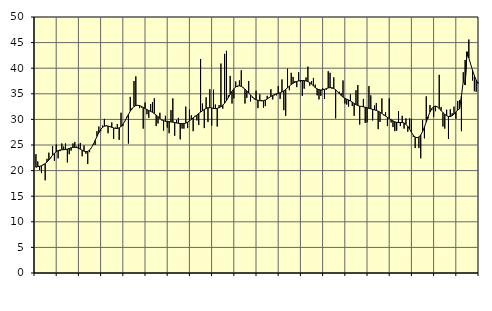
| Category | Piggar | Series 1 |
|---|---|---|
| nan | 23.2 | 20.65 |
| 1.0 | 21.8 | 20.78 |
| 1.0 | 20.1 | 20.84 |
| 1.0 | 19.5 | 20.94 |
| 1.0 | 21.3 | 21.12 |
| 1.0 | 18.1 | 21.36 |
| 1.0 | 22.3 | 21.67 |
| 1.0 | 23.5 | 22.07 |
| 1.0 | 22.4 | 22.53 |
| 1.0 | 24.8 | 23 |
| 1.0 | 21.9 | 23.41 |
| 1.0 | 25.1 | 23.72 |
| nan | 22.4 | 23.92 |
| 2.0 | 23.8 | 24.02 |
| 2.0 | 25.3 | 24.06 |
| 2.0 | 24.7 | 24.08 |
| 2.0 | 25.3 | 24.13 |
| 2.0 | 21.6 | 24.21 |
| 2.0 | 23.2 | 24.33 |
| 2.0 | 23.9 | 24.45 |
| 2.0 | 25.3 | 24.53 |
| 2.0 | 25.6 | 24.55 |
| 2.0 | 24.7 | 24.5 |
| 2.0 | 25.1 | 24.37 |
| nan | 25.4 | 24.18 |
| 3.0 | 22.8 | 23.98 |
| 3.0 | 24.9 | 23.8 |
| 3.0 | 23.3 | 23.7 |
| 3.0 | 21.3 | 23.75 |
| 3.0 | 23.6 | 24 |
| 3.0 | 24.4 | 24.47 |
| 3.0 | 25 | 25.12 |
| 3.0 | 25 | 25.89 |
| 3.0 | 27.7 | 26.68 |
| 3.0 | 28.6 | 27.42 |
| 3.0 | 27.7 | 28.02 |
| nan | 28.8 | 28.44 |
| 4.0 | 30.1 | 28.67 |
| 4.0 | 28.9 | 28.74 |
| 4.0 | 27.3 | 28.69 |
| 4.0 | 28.7 | 28.58 |
| 4.0 | 29.4 | 28.45 |
| 4.0 | 26.2 | 28.33 |
| 4.0 | 28.4 | 28.24 |
| 4.0 | 29.1 | 28.23 |
| 4.0 | 26 | 28.35 |
| 4.0 | 31.3 | 28.61 |
| 4.0 | 28.7 | 29.05 |
| nan | 29.7 | 29.62 |
| 5.0 | 30.5 | 30.28 |
| 5.0 | 25.3 | 30.97 |
| 5.0 | 34.4 | 31.61 |
| 5.0 | 32 | 32.14 |
| 5.0 | 37.5 | 32.5 |
| 5.0 | 38.4 | 32.7 |
| 5.0 | 32.7 | 32.76 |
| 5.0 | 32.2 | 32.7 |
| 5.0 | 32.3 | 32.55 |
| 5.0 | 28.2 | 32.35 |
| 5.0 | 33.3 | 32.13 |
| nan | 31 | 31.92 |
| 6.0 | 30.3 | 31.74 |
| 6.0 | 33 | 31.58 |
| 6.0 | 33.4 | 31.39 |
| 6.0 | 34.1 | 31.14 |
| 6.0 | 28.7 | 30.85 |
| 6.0 | 29.2 | 30.52 |
| 6.0 | 31.3 | 30.19 |
| 6.0 | 29.8 | 29.92 |
| 6.0 | 27.8 | 29.75 |
| 6.0 | 30.7 | 29.64 |
| 6.0 | 28.4 | 29.59 |
| nan | 27.3 | 29.55 |
| 7.0 | 31.8 | 29.51 |
| 7.0 | 34.1 | 29.46 |
| 7.0 | 26.8 | 29.39 |
| 7.0 | 29.9 | 29.3 |
| 7.0 | 30.3 | 29.24 |
| 7.0 | 26.1 | 29.2 |
| 7.0 | 28.2 | 29.17 |
| 7.0 | 28.2 | 29.19 |
| 7.0 | 32.5 | 29.28 |
| 7.0 | 28.3 | 29.46 |
| 7.0 | 31.9 | 29.7 |
| nan | 30.8 | 30 |
| 8.0 | 27.7 | 30.3 |
| 8.0 | 30.7 | 30.58 |
| 8.0 | 29.8 | 30.85 |
| 8.0 | 28.9 | 31.14 |
| 8.0 | 41.8 | 31.42 |
| 8.0 | 33.1 | 31.69 |
| 8.0 | 28.3 | 31.95 |
| 8.0 | 34.3 | 32.15 |
| 8.0 | 29.5 | 32.27 |
| 8.0 | 35.9 | 32.28 |
| 8.0 | 28.8 | 32.23 |
| nan | 35.8 | 32.15 |
| 9.0 | 32.9 | 32.11 |
| 9.0 | 28.6 | 32.15 |
| 9.0 | 32.8 | 32.28 |
| 9.0 | 40.9 | 32.49 |
| 9.0 | 32.1 | 32.78 |
| 9.0 | 42.8 | 33.17 |
| 9.0 | 43.4 | 33.67 |
| 9.0 | 34.7 | 34.27 |
| 9.0 | 38.5 | 34.88 |
| 9.0 | 33.1 | 35.48 |
| 9.0 | 34.1 | 35.98 |
| nan | 37.4 | 36.34 |
| 10.0 | 36.4 | 36.53 |
| 10.0 | 37.6 | 36.56 |
| 10.0 | 39.6 | 36.45 |
| 10.0 | 36.1 | 36.22 |
| 10.0 | 33.1 | 35.91 |
| 10.0 | 34.2 | 35.54 |
| 10.0 | 37.5 | 35.16 |
| 10.0 | 33.5 | 34.77 |
| 10.0 | 34.2 | 34.4 |
| 10.0 | 33.9 | 34.08 |
| 10.0 | 35.6 | 33.86 |
| nan | 32.2 | 33.73 |
| 11.0 | 34.9 | 33.65 |
| 11.0 | 33.8 | 33.62 |
| 11.0 | 32.3 | 33.65 |
| 11.0 | 32.6 | 33.78 |
| 11.0 | 34.6 | 33.99 |
| 11.0 | 34.2 | 34.24 |
| 11.0 | 35.9 | 34.49 |
| 11.0 | 33.9 | 34.69 |
| 11.0 | 34.7 | 34.85 |
| 11.0 | 34.7 | 34.98 |
| 11.0 | 36.5 | 35.09 |
| nan | 34 | 35.2 |
| 12.0 | 37.8 | 35.35 |
| 12.0 | 31.8 | 35.57 |
| 12.0 | 30.7 | 35.86 |
| 12.0 | 39.9 | 36.18 |
| 12.0 | 35.7 | 36.51 |
| 12.0 | 39.1 | 36.81 |
| 12.0 | 38.3 | 37.06 |
| 12.0 | 37.5 | 37.26 |
| 12.0 | 36.3 | 37.41 |
| 12.0 | 39.2 | 37.52 |
| 12.0 | 37.3 | 37.59 |
| nan | 34.6 | 37.6 |
| 13.0 | 36 | 37.57 |
| 13.0 | 38.2 | 37.5 |
| 13.0 | 40.3 | 37.39 |
| 13.0 | 36.6 | 37.2 |
| 13.0 | 37.5 | 36.9 |
| 13.0 | 38.1 | 36.55 |
| 13.0 | 36.8 | 36.22 |
| 13.0 | 34.7 | 35.96 |
| 13.0 | 33.9 | 35.81 |
| 13.0 | 34.6 | 35.75 |
| 13.0 | 36.1 | 35.78 |
| nan | 34 | 35.87 |
| 14.0 | 35.8 | 36.01 |
| 14.0 | 39.4 | 36.15 |
| 14.0 | 39.1 | 36.21 |
| 14.0 | 36 | 36.18 |
| 14.0 | 38.2 | 36.04 |
| 14.0 | 30.2 | 35.78 |
| 14.0 | 35.4 | 35.43 |
| 14.0 | 35.4 | 35.04 |
| 14.0 | 35.1 | 34.68 |
| 14.0 | 37.6 | 34.36 |
| 14.0 | 33.1 | 34.12 |
| nan | 32.9 | 33.95 |
| 15.0 | 32.5 | 33.79 |
| 15.0 | 34.9 | 33.6 |
| 15.0 | 32.6 | 33.37 |
| 15.0 | 30.7 | 33.12 |
| 15.0 | 35.7 | 32.88 |
| 15.0 | 36.7 | 32.7 |
| 15.0 | 29 | 32.6 |
| 15.0 | 32.5 | 32.53 |
| 15.0 | 34 | 32.46 |
| 15.0 | 29.3 | 32.37 |
| 15.0 | 29.4 | 32.27 |
| nan | 36.5 | 32.17 |
| 16.0 | 34.7 | 32.07 |
| 16.0 | 29.8 | 31.96 |
| 16.0 | 32.7 | 31.85 |
| 16.0 | 33.2 | 31.75 |
| 16.0 | 28.1 | 31.61 |
| 16.0 | 29.5 | 31.42 |
| 16.0 | 34.1 | 31.17 |
| 16.0 | 30.8 | 30.92 |
| 16.0 | 31.4 | 30.65 |
| 16.0 | 28.7 | 30.39 |
| 16.0 | 34.1 | 30.16 |
| nan | 29.4 | 29.93 |
| 17.0 | 28.5 | 29.7 |
| 17.0 | 27.7 | 29.53 |
| 17.0 | 27.8 | 29.43 |
| 17.0 | 31.6 | 29.38 |
| 17.0 | 28.7 | 29.39 |
| 17.0 | 30.7 | 29.38 |
| 17.0 | 28.2 | 29.3 |
| 17.0 | 30.2 | 29.05 |
| 17.0 | 27.6 | 28.63 |
| 17.0 | 30.2 | 28.08 |
| 17.0 | 30.1 | 27.47 |
| nan | 26.6 | 26.91 |
| 18.0 | 24.4 | 26.54 |
| 18.0 | 26.5 | 26.42 |
| 18.0 | 24.4 | 26.56 |
| 18.0 | 22.4 | 26.97 |
| 18.0 | 29.9 | 27.62 |
| 18.0 | 26.3 | 28.51 |
| 18.0 | 34.5 | 29.51 |
| 18.0 | 30.2 | 30.54 |
| 18.0 | 32.8 | 31.44 |
| 18.0 | 31.8 | 32.12 |
| 18.0 | 30.5 | 32.5 |
| nan | 31.6 | 32.6 |
| 19.0 | 32.4 | 32.45 |
| 19.0 | 38.7 | 32.12 |
| 19.0 | 32.4 | 31.72 |
| 19.0 | 28.6 | 31.33 |
| 19.0 | 28.2 | 30.99 |
| 19.0 | 31.9 | 30.72 |
| 19.0 | 26.2 | 30.57 |
| 19.0 | 32 | 30.56 |
| 19.0 | 31.2 | 30.71 |
| 19.0 | 32.5 | 31.03 |
| 19.0 | 30.1 | 31.44 |
| nan | 33.6 | 31.83 |
| 20.0 | 33.8 | 32.05 |
| 20.0 | 27.7 | 34.55 |
| 20.0 | 39.2 | 37.49 |
| 20.0 | 41.6 | 36.76 |
| 20.0 | 42.3 | 43.2 |
| 20.0 | 45.6 | 42.02 |
| 20.0 | 40.8 | 40.78 |
| 20.0 | 37.6 | 39.6 |
| 20.0 | 35.5 | 38.53 |
| 20.0 | 35.4 | 37.66 |
| 20.0 | 37.2 | 37.02 |